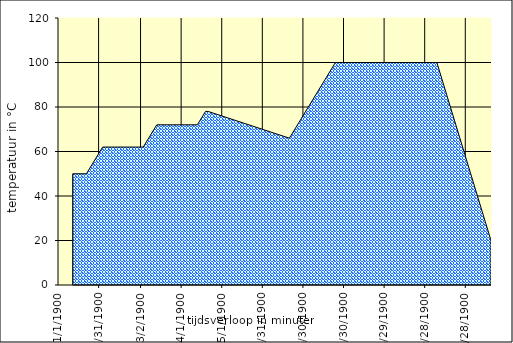
| Category | Maischschema grafisch |
|---|---|
| 0.0 | 38 |
| 0.0 | 38 |
| 12.0 | 50 |
| 22.0 | 50 |
| 34.0 | 62 |
| 64.0 | 62 |
| 74.0 | 72 |
| 104.0 | 72 |
| 110.0 | 78 |
| 112.0 | 78 |
| 112.0 | 78 |
| 172.0 | 66 |
| 206.0 | 100 |
| 281.0 | 100 |
| 281.0 | 100 |
| 321.0 | 20 |